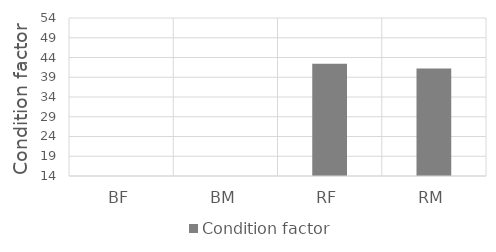
| Category | Condition factor |
|---|---|
| BF | 0 |
| BM | 0 |
| RF | 42.4 |
| RM | 41.2 |